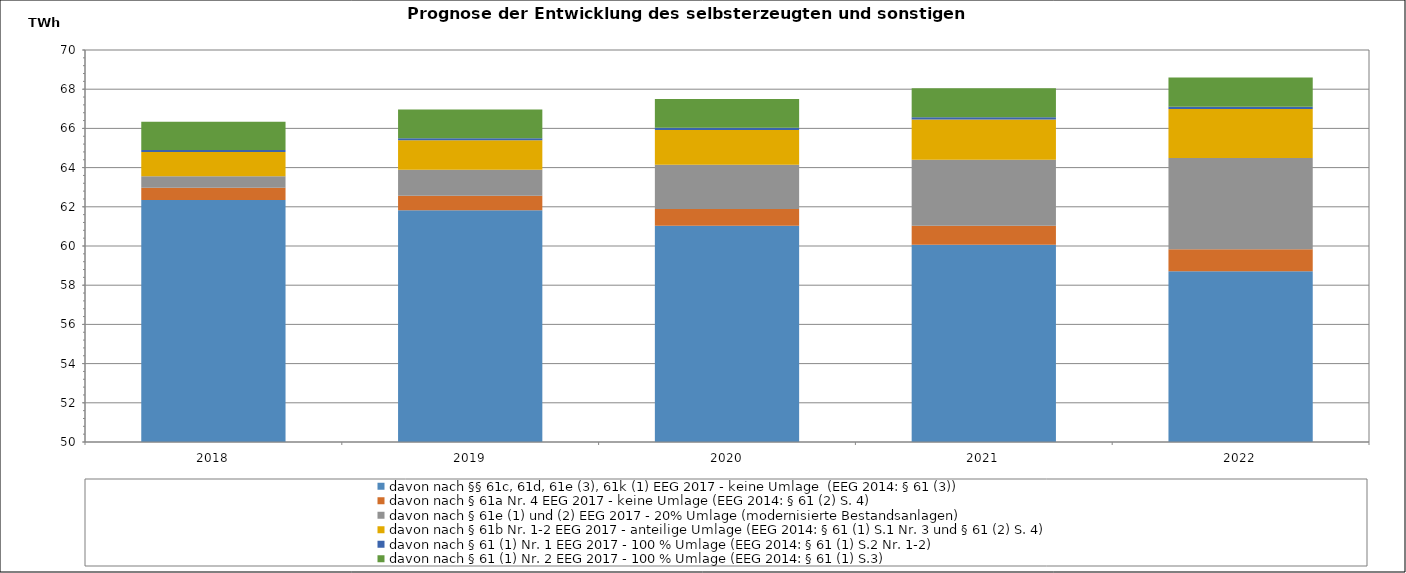
| Category | davon nach §§ 61c, 61d, 61e (3), 61k (1) EEG 2017 - keine Umlage  (EEG 2014: § 61 (3)) | davon nach § 61a Nr. 4 EEG 2017 - keine Umlage (EEG 2014: § 61 (2) S. 4) | davon nach § 61e (1) und (2) EEG 2017 - 20% Umlage (modernisierte Bestandsanlagen) | davon nach § 61b Nr. 1-2 EEG 2017 - anteilige Umlage (EEG 2014: § 61 (1) S.1 Nr. 3 und § 61 (2) S. 4) | davon nach § 61 (1) Nr. 1 EEG 2017 - 100 % Umlage (EEG 2014: § 61 (1) S.2 Nr. 1-2) | davon nach § 61 (1) Nr. 2 EEG 2017 - 100 % Umlage (EEG 2014: § 61 (1) S.3) |
|---|---|---|---|---|---|---|
| 2018.0 | 62.352 | 0.622 | 0.581 | 1.245 | 0.102 | 1.442 |
| 2019.0 | 61.828 | 0.73 | 1.334 | 1.501 | 0.107 | 1.464 |
| 2020.0 | 61.037 | 0.846 | 2.262 | 1.774 | 0.112 | 1.475 |
| 2021.0 | 60.059 | 0.969 | 3.368 | 2.053 | 0.118 | 1.48 |
| 2022.0 | 58.715 | 1.12 | 4.654 | 2.496 | 0.123 | 1.483 |